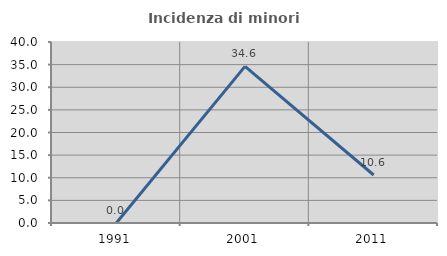
| Category | Incidenza di minori stranieri |
|---|---|
| 1991.0 | 0 |
| 2001.0 | 34.615 |
| 2011.0 | 10.606 |